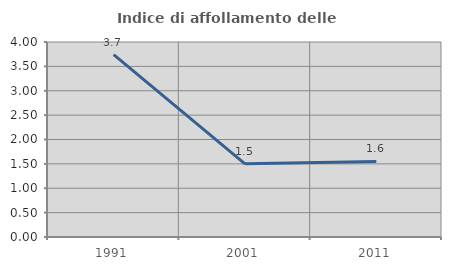
| Category | Indice di affollamento delle abitazioni  |
|---|---|
| 1991.0 | 3.743 |
| 2001.0 | 1.501 |
| 2011.0 | 1.551 |